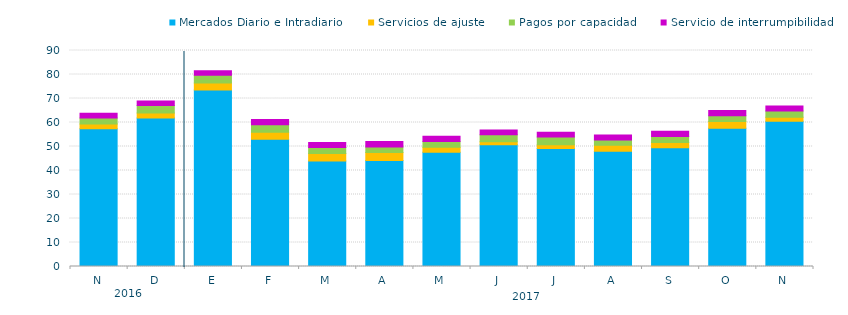
| Category | Mercados Diario e Intradiario  | Servicios de ajuste | Pagos por capacidad | Servicio de interrumpibilidad |
|---|---|---|---|---|
| N | 57.41 | 1.94 | 2.57 | 1.95 |
| D | 61.87 | 2.04 | 3.17 | 1.88 |
| E | 73.59 | 2.89 | 3.25 | 1.88 |
| F | 53.05 | 2.84 | 3.17 | 2.17 |
| M | 43.94 | 3.13 | 2.52 | 2.06 |
| A | 44.2 | 3.27 | 2.36 | 2.28 |
| M | 47.6 | 2.12 | 2.35 | 2.15 |
| J | 50.77 | 1.24 | 2.9 | 2 |
| J | 49.13 | 1.65 | 3.22 | 1.93 |
| A | 48.03 | 2.49 | 2.23 | 1.99 |
| S | 49.52 | 2.19 | 2.5 | 2.15 |
| O | 57.6 | 2.79 | 2.41 | 2.16 |
| N | 60.54 | 1.66 | 2.58 | 2.08 |